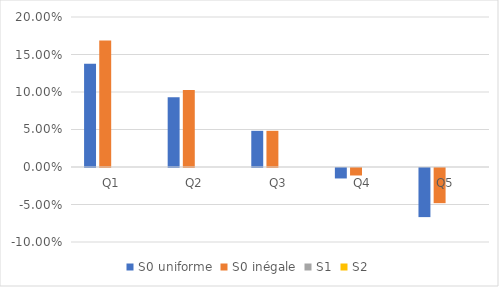
| Category | S0 uniforme | S0 inégale | S1 | S2 |
|---|---|---|---|---|
| Q1 | 0.138 | 0.169 | 0 | 0 |
| Q2 | 0.093 | 0.103 | 0 | 0 |
| Q3 | 0.048 | 0.048 | 0 | 0 |
| Q4 | -0.014 | -0.01 | 0 | 0 |
| Q5 | -0.065 | -0.047 | 0 | 0 |